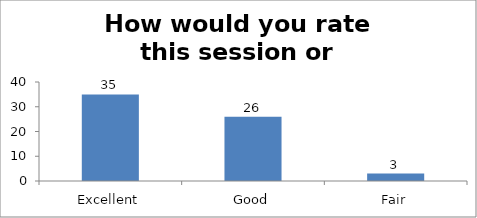
| Category | How would you rate this session or workshop? |
|---|---|
| Excellent | 35 |
| Good | 26 |
| Fair | 3 |